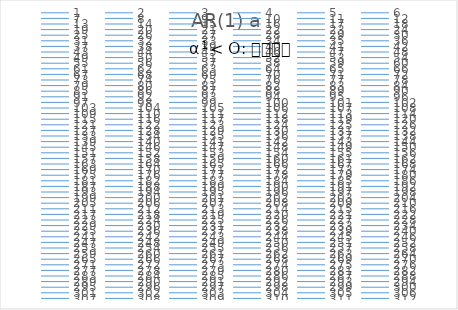
| Category | AR(1) a |
|---|---|
| 0 | 0 |
| 1 | 1.015 |
| 2 | 2.39 |
| 3 | 1.932 |
| 4 | 1.688 |
| 5 | 1.529 |
| 6 | 2.418 |
| 7 | 4.684 |
| 8 | 4.783 |
| 9 | 3.936 |
| 10 | 3.101 |
| 11 | 4.192 |
| 12 | 4.3 |
| 13 | 5.874 |
| 14 | 4.491 |
| 15 | 4.877 |
| 16 | 4.528 |
| 17 | 4.744 |
| 18 | 5.599 |
| 19 | 6.461 |
| 20 | 5.068 |
| 21 | 5.283 |
| 22 | 6.73 |
| 23 | 7.352 |
| 24 | 6.387 |
| 25 | 5.358 |
| 26 | 5.581 |
| 27 | 5.216 |
| 28 | 4.443 |
| 29 | 4.538 |
| 30 | 4.174 |
| 31 | 5.513 |
| 32 | 4.64 |
| 33 | 5.775 |
| 34 | 4.355 |
| 35 | 5.284 |
| 36 | 4.958 |
| 37 | 5.074 |
| 38 | 5.57 |
| 39 | 4.656 |
| 40 | 5.387 |
| 41 | 5.399 |
| 42 | 6.443 |
| 43 | 6.777 |
| 44 | 4.843 |
| 45 | 4.366 |
| 46 | 5.105 |
| 47 | 5.969 |
| 48 | 5.791 |
| 49 | 5.948 |
| 50 | 5.523 |
| 51 | 6.411 |
| 52 | 4.388 |
| 53 | 5.108 |
| 54 | 2.983 |
| 55 | 1.531 |
| 56 | 3.066 |
| 57 | 3.996 |
| 58 | 3.197 |
| 59 | 3.858 |
| 60 | 4.185 |
| 61 | 4.191 |
| 62 | 4.609 |
| 63 | 5.142 |
| 64 | 5.904 |
| 65 | 6.551 |
| 66 | 4.426 |
| 67 | 4.151 |
| 68 | 4.593 |
| 69 | 5.975 |
| 70 | 5.583 |
| 71 | 7.741 |
| 72 | 5.393 |
| 73 | 7.613 |
| 74 | 9.541 |
| 75 | 7.937 |
| 76 | 5.819 |
| 77 | 4.243 |
| 78 | 2.365 |
| 79 | 2.022 |
| 80 | 2.287 |
| 81 | 1.902 |
| 82 | 3.976 |
| 83 | 2.646 |
| 84 | 1.798 |
| 85 | 2.379 |
| 86 | 1.571 |
| 87 | 0.731 |
| 88 | 1.065 |
| 89 | 0.856 |
| 90 | -0.144 |
| 91 | -1.413 |
| 92 | -0.722 |
| 93 | -0.144 |
| 94 | -0.587 |
| 95 | 0.446 |
| 96 | 2.16 |
| 97 | 3.842 |
| 98 | 4.575 |
| 99 | 5.688 |
| 100 | 5.348 |
| 101 | 4.897 |
| 102 | 4.62 |
| 103 | 3.857 |
| 104 | 4.573 |
| 105 | 5.901 |
| 106 | 3.825 |
| 107 | 2.23 |
| 108 | 2.862 |
| 109 | 2.922 |
| 110 | 2.863 |
| 111 | 3.065 |
| 112 | 3.756 |
| 113 | 4.718 |
| 114 | 4.077 |
| 115 | 4.564 |
| 116 | 3.291 |
| 117 | 3.858 |
| 118 | 4.925 |
| 119 | 5.23 |
| 120 | 5.392 |
| 121 | 5.229 |
| 122 | 4.159 |
| 123 | 5.489 |
| 124 | 5.126 |
| 125 | 4.943 |
| 126 | 4.779 |
| 127 | 4.293 |
| 128 | 4.007 |
| 129 | 3.573 |
| 130 | 4.736 |
| 131 | 4.105 |
| 132 | 3.065 |
| 133 | 3.74 |
| 134 | 2.801 |
| 135 | 1.452 |
| 136 | 1.704 |
| 137 | 2.913 |
| 138 | 2.831 |
| 139 | 1.491 |
| 140 | 3.299 |
| 141 | 4.065 |
| 142 | 4.832 |
| 143 | 4.567 |
| 144 | 4.451 |
| 145 | 3.828 |
| 146 | 2.591 |
| 147 | 3.38 |
| 148 | 4.135 |
| 149 | 4.862 |
| 150 | 5.571 |
| 151 | 5.364 |
| 152 | 4.795 |
| 153 | 5.611 |
| 154 | 6.035 |
| 155 | 6.501 |
| 156 | 6.867 |
| 157 | 7.076 |
| 158 | 6.357 |
| 159 | 6.697 |
| 160 | 6.413 |
| 161 | 6.65 |
| 162 | 5.422 |
| 163 | 6.302 |
| 164 | 6.129 |
| 165 | 6.644 |
| 166 | 5.5 |
| 167 | 7.346 |
| 168 | 8.232 |
| 169 | 6.808 |
| 170 | 6.448 |
| 171 | 5.733 |
| 172 | 5.045 |
| 173 | 5.37 |
| 174 | 4.077 |
| 175 | 3.237 |
| 176 | 2.557 |
| 177 | 4.508 |
| 178 | 3.1 |
| 179 | 3.251 |
| 180 | 3.314 |
| 181 | 4.742 |
| 182 | 3.296 |
| 183 | 3.595 |
| 184 | 3.747 |
| 185 | 3.328 |
| 186 | 2.888 |
| 187 | 3.223 |
| 188 | 4.298 |
| 189 | 3.958 |
| 190 | 2.772 |
| 191 | 3.318 |
| 192 | 4.409 |
| 193 | 5.104 |
| 194 | 5.495 |
| 195 | 6.442 |
| 196 | 5.357 |
| 197 | 5.751 |
| 198 | 7.009 |
| 199 | 7.131 |
| 200 | 6.281 |
| 201 | 5.916 |
| 202 | 7.122 |
| 203 | 7.98 |
| 204 | 7.322 |
| 205 | 6.513 |
| 206 | 5.805 |
| 207 | 6.291 |
| 208 | 6.231 |
| 209 | 6.638 |
| 210 | 6.56 |
| 211 | 4.781 |
| 212 | 5.544 |
| 213 | 5.526 |
| 214 | 4.416 |
| 215 | 6.674 |
| 216 | 6.056 |
| 217 | 7.032 |
| 218 | 6.443 |
| 219 | 5.226 |
| 220 | 6.252 |
| 221 | 7.047 |
| 222 | 7.446 |
| 223 | 6.054 |
| 224 | 5.236 |
| 225 | 5.879 |
| 226 | 4.267 |
| 227 | 5.071 |
| 228 | 3.21 |
| 229 | 3.913 |
| 230 | 5.143 |
| 231 | 5.127 |
| 232 | 2.992 |
| 233 | 4.431 |
| 234 | 5.464 |
| 235 | 5.216 |
| 236 | 6.349 |
| 237 | 6.007 |
| 238 | 6.405 |
| 239 | 4.551 |
| 240 | 3.947 |
| 241 | 3.97 |
| 242 | 4.047 |
| 243 | 4.551 |
| 244 | 6.06 |
| 245 | 6.129 |
| 246 | 7.189 |
| 247 | 5.594 |
| 248 | 5.767 |
| 249 | 5.511 |
| 250 | 4.135 |
| 251 | 4.661 |
| 252 | 3.364 |
| 253 | 3.703 |
| 254 | 3.385 |
| 255 | 4.622 |
| 256 | 5.912 |
| 257 | 4.672 |
| 258 | 3.748 |
| 259 | 5.39 |
| 260 | 6.453 |
| 261 | 7.326 |
| 262 | 6.677 |
| 263 | 8.919 |
| 264 | 8.177 |
| 265 | 6.526 |
| 266 | 6.881 |
| 267 | 6.393 |
| 268 | 7.546 |
| 269 | 8.013 |
| 270 | 8.415 |
| 271 | 7.351 |
| 272 | 6.568 |
| 273 | 6.404 |
| 274 | 6.599 |
| 275 | 7.121 |
| 276 | 4.935 |
| 277 | 4.476 |
| 278 | 3.513 |
| 279 | 2.614 |
| 280 | 2.693 |
| 281 | 5.946 |
| 282 | 5.838 |
| 283 | 6.334 |
| 284 | 6.061 |
| 285 | 6.216 |
| 286 | 7.905 |
| 287 | 5.722 |
| 288 | 7.245 |
| 289 | 6.541 |
| 290 | 6.547 |
| 291 | 6.46 |
| 292 | 7.791 |
| 293 | 6.291 |
| 294 | 6.974 |
| 295 | 7.15 |
| 296 | 5.928 |
| 297 | 4.63 |
| 298 | 2.38 |
| 299 | 2.242 |
| 300 | 2.742 |
| 301 | 2.476 |
| 302 | 2.656 |
| 303 | 2.919 |
| 304 | 4 |
| 305 | 2.879 |
| 306 | 3.801 |
| 307 | 4.582 |
| 308 | 4.971 |
| 309 | 5.675 |
| 310 | 6.022 |
| 311 | 5.392 |
| 312 | 6.628 |
| 313 | 5.745 |
| 314 | 5.938 |
| 315 | 6.617 |
| 316 | 6.237 |
| 317 | 8.065 |
| 318 | 8.254 |
| 319 | 7.719 |
| 320 | 7.916 |
| 321 | 8.074 |
| 322 | 8.235 |
| 323 | 7.88 |
| 324 | 7.599 |
| 325 | 6.43 |
| 326 | 4.576 |
| 327 | 3.306 |
| 328 | 3.707 |
| 329 | 2.309 |
| 330 | 2.137 |
| 331 | 3.633 |
| 332 | 3.53 |
| 333 | 4.192 |
| 334 | 4.832 |
| 335 | 3.707 |
| 336 | 4.165 |
| 337 | 4.33 |
| 338 | 1.915 |
| 339 | 2.933 |
| 340 | 3.818 |
| 341 | 5.015 |
| 342 | 4.433 |
| 343 | 4.097 |
| 344 | 6.146 |
| 345 | 4.34 |
| 346 | 4.216 |
| 347 | 4.607 |
| 348 | 4.08 |
| 349 | 2.676 |
| 350 | 3.933 |
| 351 | 3.022 |
| 352 | 3.02 |
| 353 | 3.237 |
| 354 | 3.683 |
| 355 | 4.946 |
| 356 | 5.581 |
| 357 | 4.65 |
| 358 | 4.563 |
| 359 | 4.241 |
| 360 | 6.088 |
| 361 | 6.695 |
| 362 | 6.667 |
| 363 | 5.68 |
| 364 | 6.739 |
| 365 | 7.225 |
| 366 | 7.88 |
| 367 | 6.707 |
| 368 | 4.08 |
| 369 | 3.61 |
| 370 | 2.884 |
| 371 | 3.668 |
| 372 | 4.847 |
| 373 | 5.171 |
| 374 | 4.74 |
| 375 | 3.84 |
| 376 | 4.066 |
| 377 | 4.841 |
| 378 | 4.675 |
| 379 | 5.766 |
| 380 | 5.02 |
| 381 | 5.576 |
| 382 | 4.546 |
| 383 | 4.818 |
| 384 | 4.602 |
| 385 | 3.497 |
| 386 | 4.574 |
| 387 | 4.939 |
| 388 | 4.142 |
| 389 | 5.425 |
| 390 | 4.711 |
| 391 | 4.982 |
| 392 | 5.736 |
| 393 | 5.241 |
| 394 | 4.63 |
| 395 | 5.284 |
| 396 | 5.173 |
| 397 | 5.783 |
| 398 | 4.415 |
| 399 | 4.75 |
| 400 | 4.265 |
| 401 | 4.727 |
| 402 | 2.868 |
| 403 | 3.02 |
| 404 | 3.438 |
| 405 | 4.835 |
| 406 | 6.13 |
| 407 | 3.96 |
| 408 | 3.786 |
| 409 | 4.594 |
| 410 | 6.763 |
| 411 | 8.32 |
| 412 | 8.261 |
| 413 | 6.736 |
| 414 | 6.782 |
| 415 | 6.874 |
| 416 | 8.28 |
| 417 | 8.775 |
| 418 | 9.943 |
| 419 | 8.475 |
| 420 | 7.189 |
| 421 | 5.642 |
| 422 | 4.618 |
| 423 | 5.225 |
| 424 | 3.901 |
| 425 | 5.086 |
| 426 | 5.217 |
| 427 | 5.403 |
| 428 | 4.78 |
| 429 | 5.305 |
| 430 | 5.805 |
| 431 | 6.106 |
| 432 | 6.665 |
| 433 | 7.059 |
| 434 | 7.63 |
| 435 | 7.748 |
| 436 | 7.209 |
| 437 | 6.611 |
| 438 | 6.844 |
| 439 | 8.039 |
| 440 | 7.181 |
| 441 | 5.888 |
| 442 | 5.63 |
| 443 | 5.933 |
| 444 | 5.732 |
| 445 | 6.322 |
| 446 | 6.358 |
| 447 | 6.272 |
| 448 | 4.477 |
| 449 | 4.704 |
| 450 | 3.67 |
| 451 | 3.771 |
| 452 | 4.078 |
| 453 | 4.154 |
| 454 | 4.157 |
| 455 | 4.234 |
| 456 | 3.331 |
| 457 | 4.571 |
| 458 | 6.072 |
| 459 | 3.052 |
| 460 | 3.184 |
| 461 | 3.177 |
| 462 | 3.767 |
| 463 | 3.105 |
| 464 | 2.868 |
| 465 | 4.297 |
| 466 | 4.684 |
| 467 | 3.644 |
| 468 | 2.416 |
| 469 | 2.225 |
| 470 | 3.142 |
| 471 | 3.33 |
| 472 | 4.767 |
| 473 | 3.043 |
| 474 | 2.965 |
| 475 | 3.676 |
| 476 | 3.69 |
| 477 | 4.652 |
| 478 | 4.735 |
| 479 | 6.494 |
| 480 | 8.009 |
| 481 | 6.889 |
| 482 | 6.979 |
| 483 | 5.558 |
| 484 | 5.538 |
| 485 | 3.887 |
| 486 | 4.805 |
| 487 | 6.79 |
| 488 | 5.471 |
| 489 | 6.455 |
| 490 | 5.854 |
| 491 | 7.159 |
| 492 | 7.251 |
| 493 | 7.633 |
| 494 | 6.286 |
| 495 | 6.343 |
| 496 | 5.469 |
| 497 | 5.215 |
| 498 | 5.243 |
| 499 | 4.883 |
| 500 | 4.567 |
| 501 | 3.667 |
| 502 | 3.098 |
| 503 | 5.074 |
| 504 | 4.512 |
| 505 | 3.942 |
| 506 | 2.973 |
| 507 | 4.322 |
| 508 | 5.915 |
| 509 | 5.11 |
| 510 | 2.993 |
| 511 | 2.808 |
| 512 | 2.305 |
| 513 | 3.384 |
| 514 | 4.213 |
| 515 | 4.516 |
| 516 | 5.488 |
| 517 | 3.17 |
| 518 | 3.86 |
| 519 | 4.368 |
| 520 | 3.696 |
| 521 | 5.282 |
| 522 | 3.538 |
| 523 | 2.971 |
| 524 | 3.421 |
| 525 | 3.634 |
| 526 | 4.182 |
| 527 | 6.442 |
| 528 | 6.345 |
| 529 | 5.44 |
| 530 | 5.313 |
| 531 | 5.129 |
| 532 | 5.736 |
| 533 | 6.277 |
| 534 | 5.806 |
| 535 | 5.65 |
| 536 | 5.352 |
| 537 | 5.915 |
| 538 | 6.29 |
| 539 | 6.555 |
| 540 | 6.562 |
| 541 | 9.199 |
| 542 | 8.806 |
| 543 | 8.113 |
| 544 | 5.931 |
| 545 | 4.794 |
| 546 | 4.499 |
| 547 | 5.755 |
| 548 | 5.797 |
| 549 | 5.804 |
| 550 | 6.158 |
| 551 | 5.929 |
| 552 | 4.813 |
| 553 | 4.139 |
| 554 | 3.483 |
| 555 | 3.863 |
| 556 | 4.945 |
| 557 | 5.806 |
| 558 | 6.731 |
| 559 | 6.383 |
| 560 | 6.621 |
| 561 | 6.431 |
| 562 | 6.302 |
| 563 | 7.496 |
| 564 | 7.353 |
| 565 | 6.185 |
| 566 | 6.322 |
| 567 | 6.035 |
| 568 | 5.445 |
| 569 | 3.864 |
| 570 | 5.722 |
| 571 | 6.669 |
| 572 | 5.736 |
| 573 | 5.757 |
| 574 | 4.049 |
| 575 | 4.071 |
| 576 | 3.537 |
| 577 | 1.897 |
| 578 | 3.892 |
| 579 | 3.5 |
| 580 | 1.588 |
| 581 | 2.178 |
| 582 | 1.527 |
| 583 | 4.404 |
| 584 | 5.556 |
| 585 | 5.719 |
| 586 | 6.112 |
| 587 | 3.758 |
| 588 | 3.869 |
| 589 | 4.824 |
| 590 | 5.082 |
| 591 | 6.754 |
| 592 | 4.459 |
| 593 | 5.077 |
| 594 | 5.044 |
| 595 | 5.194 |
| 596 | 7.588 |
| 597 | 7.853 |
| 598 | 5.087 |
| 599 | 5.019 |
| 600 | 4.021 |